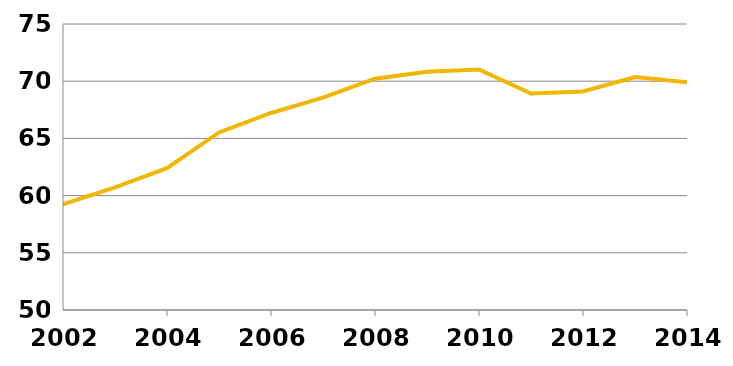
| Category | Totalt |
|---|---|
| 2002-09-30 | 59.233 |
| 2003-09-30 | 60.724 |
| 2004-09-30 | 62.402 |
| 2005-09-30 | 65.523 |
| 2006-09-30 | 67.222 |
| 2007-09-30 | 68.557 |
| 2008-09-30 | 70.219 |
| 2009-09-30 | 70.824 |
| 2010-09-30 | 71.029 |
| 2011-09-30 | 68.922 |
| 2012-09-30 | 69.102 |
| 2013-09-30 | 70.356 |
| 2014-09-30 | 69.905 |